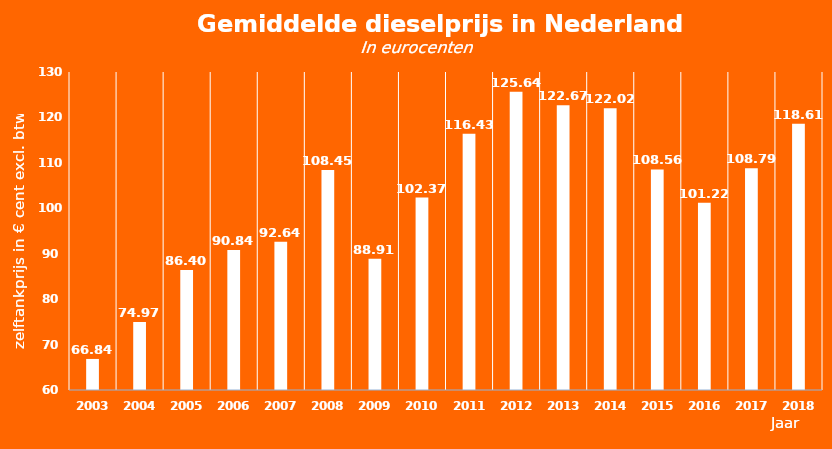
| Category | 2003 |
|---|---|
| 2003.0 | 66.835 |
| 2004.0 | 74.968 |
| 2005.0 | 86.396 |
| 2006.0 | 90.837 |
| 2007.0 | 92.645 |
| 2008.0 | 108.446 |
| 2009.0 | 88.912 |
| 2010.0 | 102.373 |
| 2011.0 | 116.434 |
| 2012.0 | 125.64 |
| 2013.0 | 122.67 |
| 2014.0 | 122.019 |
| 2015.0 | 108.56 |
| 2016.0 | 101.22 |
| 2017.0 | 108.79 |
| 2018.0 | 118.613 |